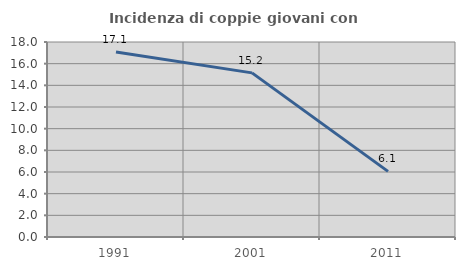
| Category | Incidenza di coppie giovani con figli |
|---|---|
| 1991.0 | 17.073 |
| 2001.0 | 15.152 |
| 2011.0 | 6.061 |